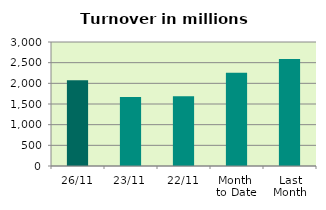
| Category | Series 0 |
|---|---|
| 26/11 | 2077.305 |
| 23/11 | 1670.003 |
| 22/11 | 1684.774 |
| Month 
to Date | 2257.327 |
| Last
Month | 2586.958 |